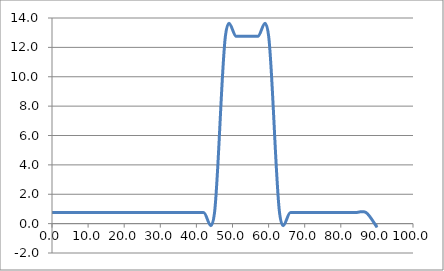
| Category | Elevation (in.) |
|---|---|
| 0.024 | 0.75 |
| 3.024 | 0.75 |
| 6.024 | 0.75 |
| 9.024000000000001 | 0.75 |
| 12.024000000000001 | 0.75 |
| 15.024000000000001 | 0.75 |
| 18.024 | 0.75 |
| 21.024 | 0.75 |
| 24.023999999999997 | 0.75 |
| 27.023999999999997 | 0.75 |
| 30.023999999999997 | 0.75 |
| 33.024 | 0.75 |
| 36.024 | 0.75 |
| 39.024 | 0.75 |
| 42.024 | 0.75 |
| 45.024 | 0.75 |
| 48.024 | 12.75 |
| 51.024 | 12.75 |
| 54.024 | 12.75 |
| 57.024 | 12.75 |
| 60.024 | 12.75 |
| 63.024 | 0.75 |
| 66.024 | 0.75 |
| 69.024 | 0.75 |
| 72.024 | 0.75 |
| 75.024 | 0.75 |
| 78.024 | 0.75 |
| 81.024 | 0.75 |
| 84.024 | 0.75 |
| 87.024 | 0.75 |
| 90.024 | -0.25 |